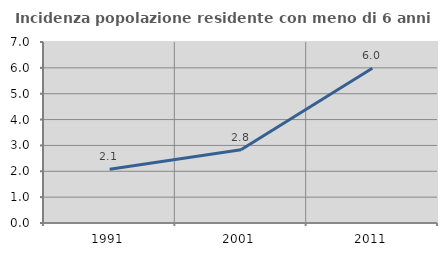
| Category | Incidenza popolazione residente con meno di 6 anni |
|---|---|
| 1991.0 | 2.075 |
| 2001.0 | 2.834 |
| 2011.0 | 5.986 |